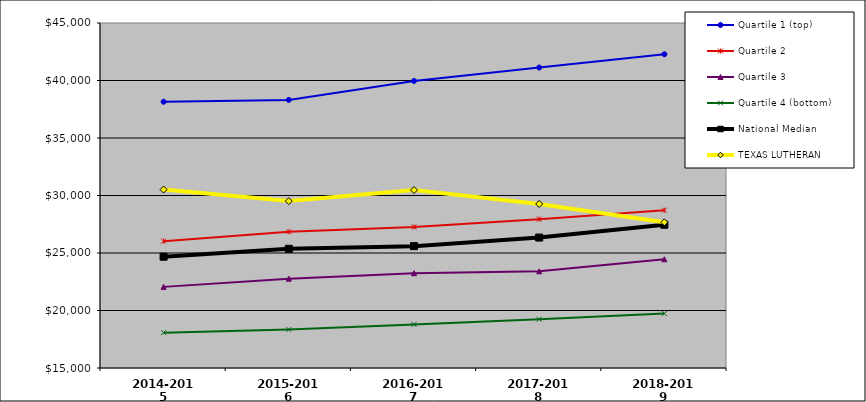
| Category | Quartile 1 (top) | Quartile 2 | Quartile 3 | Quartile 4 (bottom) | National Median | TEXAS LUTHERAN |
|---|---|---|---|---|---|---|
| 2014-2015 | 38152.453 | 26030.799 | 22054.18 | 18075.702 | 24676.206 | 30515.957 |
| 2015-2016 | 38310.871 | 26850.125 | 22767.562 | 18349.279 | 25364.205 | 29513.209 |
| 2016-2017 | 39961.44 | 27265.263 | 23241.044 | 18788.871 | 25597.574 | 30475.146 |
| 2017-2018 | 41125.922 | 27943.174 | 23408.6 | 19245.028 | 26342.841 | 29264.768 |
| 2018-2019 | 42278.693 | 28721.813 | 24453.972 | 19736.2 | 27452.913 | 27668.054 |